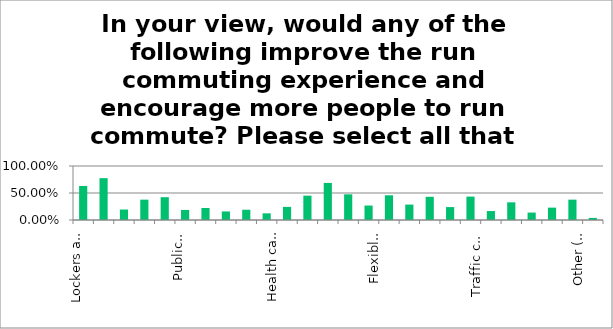
| Category | Responses |
|---|---|
| Lockers at work | 0.63 |
| Showers at work | 0.775 |
| Water points at work | 0.194 |
| Hair drying facilities at work | 0.377 |
| Clothes washing / drying facilities at work | 0.422 |
| Public lockers | 0.187 |
| Public showers | 0.222 |
| Public water points | 0.158 |
| Paid for, private shower facilities | 0.19 |
| Paid for, private locker facilities | 0.123 |
| Health care/plan incentives | 0.243 |
| Financial incentives | 0.451 |
| Government Run to Work Scheme offering tax reduction of running products | 0.687 |
| Supportive workplace environment | 0.475 |
| Local run commuting groups / buses | 0.268 |
| Flexible working hours | 0.458 |
| Dedicated running lane | 0.285 |
| Public promotion of run commuting | 0.43 |
| Improved pavement surfaces | 0.239 |
| Normalisation of run commuting | 0.433 |
| Traffic calming measures | 0.166 |
| Pollution reduction measures | 0.328 |
| Rucksack escorting service | 0.137 |
| Promotion of offroad routes | 0.229 |
| Improved running rucksacks, tailored for run commuting | 0.377 |
| Other (please specify) | 0.039 |